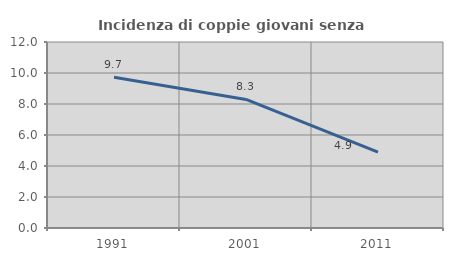
| Category | Incidenza di coppie giovani senza figli |
|---|---|
| 1991.0 | 9.725 |
| 2001.0 | 8.294 |
| 2011.0 | 4.899 |